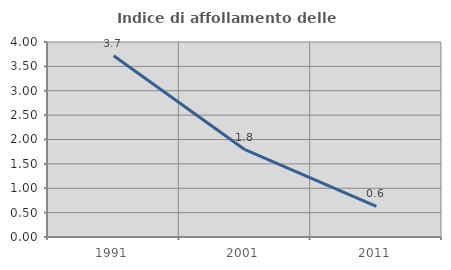
| Category | Indice di affollamento delle abitazioni  |
|---|---|
| 1991.0 | 3.72 |
| 2001.0 | 1.792 |
| 2011.0 | 0.628 |